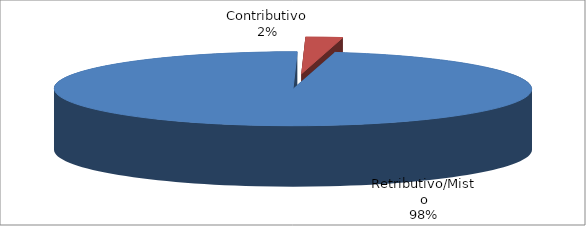
| Category | Series 1 |
|---|---|
| Retributivo/Misto | 79575 |
| Contributivo | 2039 |